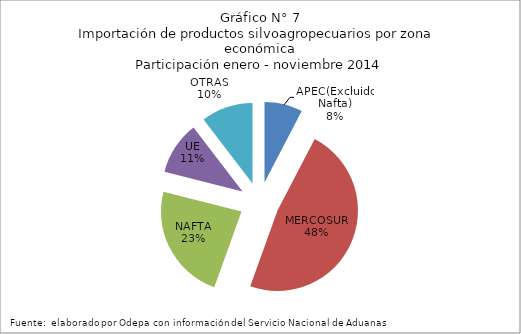
| Category | Series 0 |
|---|---|
| APEC(Excluido Nafta) | 393699.1 |
| MERCOSUR | 2462947.382 |
| NAFTA | 1208505.53 |
| UE | 547065.131 |
| OTRAS | 535569.857 |